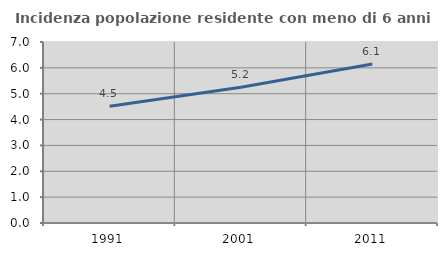
| Category | Incidenza popolazione residente con meno di 6 anni |
|---|---|
| 1991.0 | 4.511 |
| 2001.0 | 5.25 |
| 2011.0 | 6.147 |